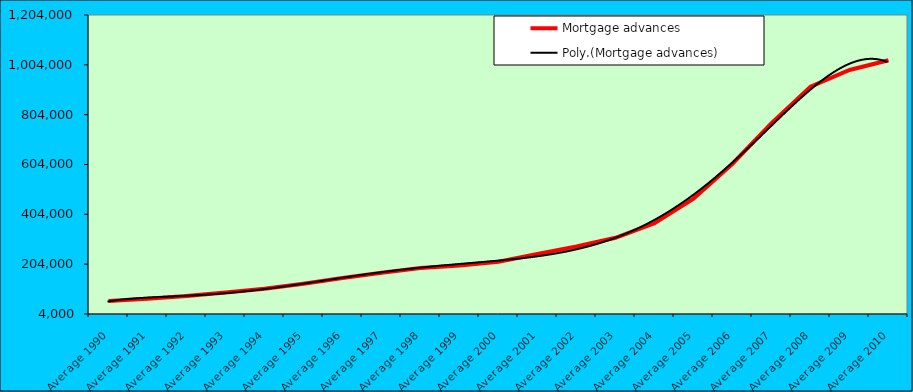
| Category | Mortgage advances |
|---|---|
| Average 1990 | 55774.333 |
| Average 1991 | 65278.083 |
| Average 1992 | 76558.167 |
| Average 1993 | 90123.417 |
| Average 1994 | 105359.333 |
| Average 1995 | 125662.167 |
| Average 1996 | 148595 |
| Average 1997 | 169484.833 |
| Average 1998 | 188294.75 |
| Average 1999 | 198923.818 |
| Average 2000 | 213769.583 |
| Average 2001 | 244476.636 |
| Average 2002 | 274873.333 |
| Average 2003 | 309819.333 |
| Average 2004 | 368591.917 |
| Average 2005 | 467276.583 |
| Average 2006 | 606976.583 |
| Average 2007 | 769995.917 |
| Average 2008 | 916337.333 |
| Average 2009 | 983455.583 |
| Average 2010 | 1022158.333 |